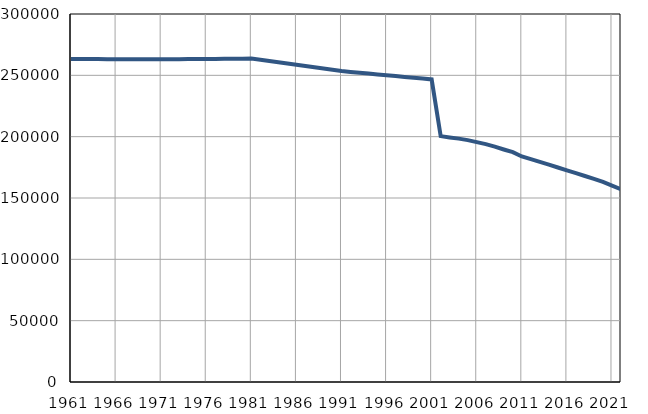
| Category | Population
size |
|---|---|
| 1961.0 | 263344 |
| 1962.0 | 263311 |
| 1963.0 | 263278 |
| 1964.0 | 263245 |
| 1965.0 | 263212 |
| 1966.0 | 263180 |
| 1967.0 | 263147 |
| 1968.0 | 263114 |
| 1969.0 | 263081 |
| 1970.0 | 263048 |
| 1971.0 | 263015 |
| 1972.0 | 263081 |
| 1973.0 | 263147 |
| 1974.0 | 263214 |
| 1975.0 | 263280 |
| 1976.0 | 263346 |
| 1977.0 | 263412 |
| 1978.0 | 263478 |
| 1979.0 | 263545 |
| 1980.0 | 263611 |
| 1981.0 | 263677 |
| 1982.0 | 262659 |
| 1983.0 | 261640 |
| 1984.0 | 260622 |
| 1985.0 | 259603 |
| 1986.0 | 258585 |
| 1987.0 | 257566 |
| 1988.0 | 256548 |
| 1989.0 | 255530 |
| 1990.0 | 254511 |
| 1991.0 | 253492 |
| 1992.0 | 252812 |
| 1993.0 | 252132 |
| 1994.0 | 251452 |
| 1995.0 | 250772 |
| 1996.0 | 250092 |
| 1997.0 | 249411 |
| 1998.0 | 248731 |
| 1999.0 | 248051 |
| 2000.0 | 247371 |
| 2001.0 | 246691 |
| 2002.0 | 200454 |
| 2003.0 | 199347 |
| 2004.0 | 198400 |
| 2005.0 | 197194 |
| 2006.0 | 195570 |
| 2007.0 | 193944 |
| 2008.0 | 191906 |
| 2009.0 | 189556 |
| 2010.0 | 187341 |
| 2011.0 | 183860 |
| 2012.0 | 181666 |
| 2013.0 | 179451 |
| 2014.0 | 177217 |
| 2015.0 | 174888 |
| 2016.0 | 172515 |
| 2017.0 | 170207 |
| 2018.0 | 167922 |
| 2019.0 | 165635 |
| 2020.0 | 163058 |
| 2021.0 | 160070 |
| 2022.0 | 157064 |